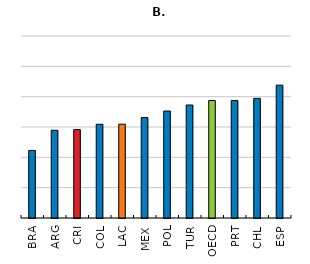
| Category | Efficiency of seaport services (1-7) |
|---|---|
| BRA | 3.226 |
| ARG | 3.892 |
| CRI | 3.913 |
| COL | 4.089 |
| LAC | 4.093 |
| MEX | 4.313 |
| POL | 4.526 |
| TUR | 4.724 |
| OECD | 4.873 |
| PRT | 4.875 |
| CHL | 4.945 |
| ESP | 5.38 |